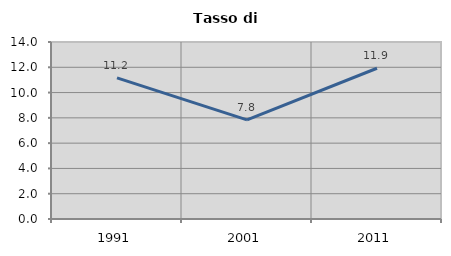
| Category | Tasso di disoccupazione   |
|---|---|
| 1991.0 | 11.163 |
| 2001.0 | 7.839 |
| 2011.0 | 11.923 |